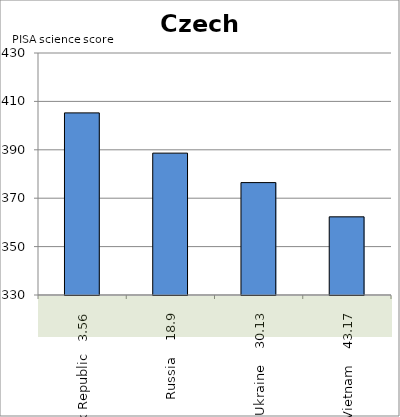
| Category | Czech Republic |
|---|---|
| Slovak Republic   3.56 | 405.258 |
| Russia    18.9 | 388.624 |
| Ukraine    30.13 | 376.445 |
| Vietnam    43.17 | 362.3 |